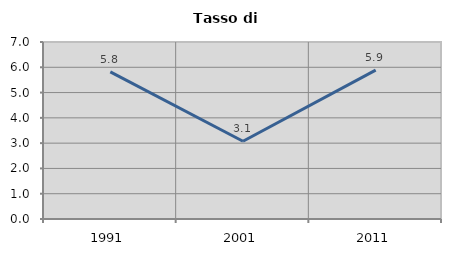
| Category | Tasso di disoccupazione   |
|---|---|
| 1991.0 | 5.817 |
| 2001.0 | 3.076 |
| 2011.0 | 5.888 |